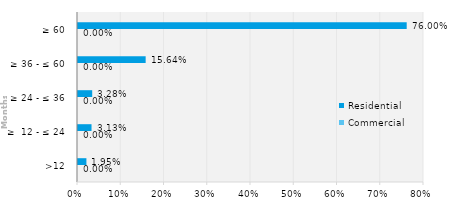
| Category | Commercial | Residential |
|---|---|---|
| >12 | 0 | 0.019 |
| ≥  12 - ≤ 24 | 0 | 0.031 |
| ≥ 24 - ≤ 36 | 0 | 0.033 |
| ≥ 36 - ≤ 60 | 0 | 0.156 |
| ≥ 60 | 0 | 0.76 |